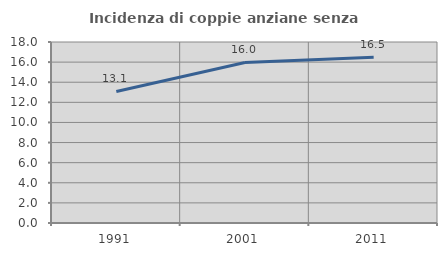
| Category | Incidenza di coppie anziane senza figli  |
|---|---|
| 1991.0 | 13.078 |
| 2001.0 | 15.966 |
| 2011.0 | 16.488 |